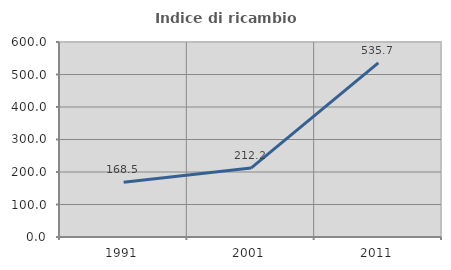
| Category | Indice di ricambio occupazionale  |
|---|---|
| 1991.0 | 168.478 |
| 2001.0 | 212.195 |
| 2011.0 | 535.714 |